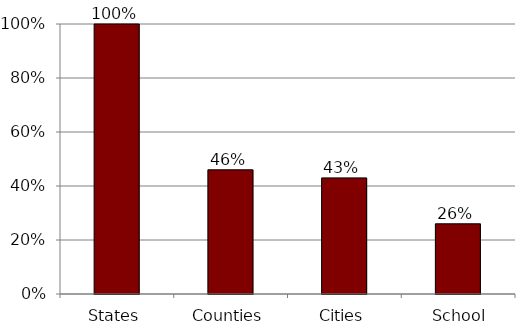
| Category | Series 0 |
|---|---|
| States | 1 |
| Counties | 0.46 |
| Cities | 0.43 |
| School districts | 0.26 |